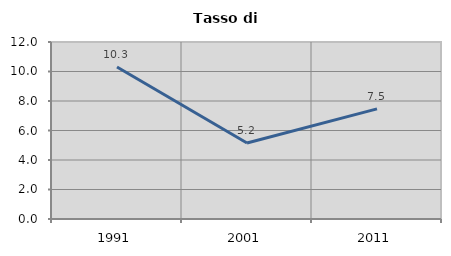
| Category | Tasso di disoccupazione   |
|---|---|
| 1991.0 | 10.3 |
| 2001.0 | 5.155 |
| 2011.0 | 7.469 |